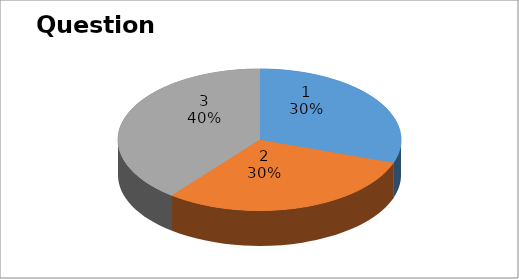
| Category | Series 0 |
|---|---|
| 0 | 10 |
| 1 | 10 |
| 2 | 13 |